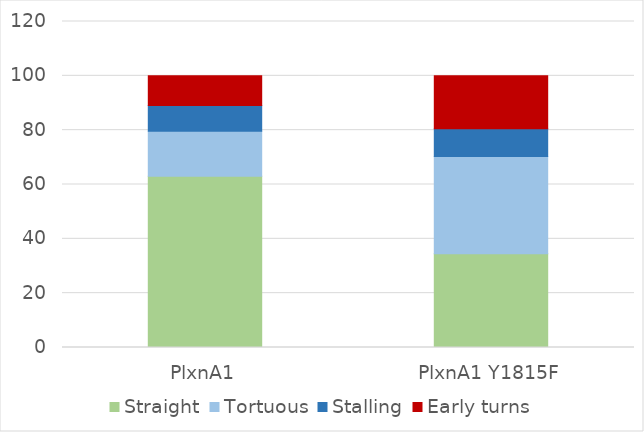
| Category | Straight | Tortuous | Stalling | Early turns |
|---|---|---|---|---|
| PlxnA1 | 63.033 | 16.588 | 9.479 | 10.9 |
| PlxnA1 Y1815F | 34.471 | 35.836 | 10.239 | 19.454 |